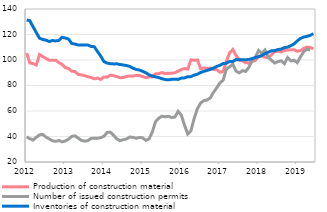
| Category | Production of construction material |
|---|---|
| 2012-01-01 | 105.487 |
| 2012-02-01 | 97.69 |
| 2012-03-01 | 97.16 |
| 2012-04-01 | 96.046 |
| 2012-05-01 | 104.325 |
| 2012-06-01 | 102.702 |
| 2012-07-01 | 101.24 |
| 2012-08-01 | 99.748 |
| 2012-09-01 | 99.904 |
| 2012-10-01 | 99.87 |
| 2012-11-01 | 97.946 |
| 2012-12-01 | 96.578 |
| 2013-01-01 | 93.977 |
| 2013-02-01 | 93.384 |
| 2013-03-01 | 91.126 |
| 2013-04-01 | 91.027 |
| 2013-05-01 | 88.668 |
| 2013-06-01 | 88.34 |
| 2013-07-01 | 87.726 |
| 2013-08-01 | 86.868 |
| 2013-09-01 | 86.315 |
| 2013-10-01 | 85.215 |
| 2013-11-01 | 85.818 |
| 2013-12-01 | 84.776 |
| 2014-01-01 | 86.746 |
| 2014-02-01 | 86.469 |
| 2014-03-01 | 88.187 |
| 2014-04-01 | 87.678 |
| 2014-05-01 | 86.986 |
| 2014-06-01 | 86.071 |
| 2014-07-01 | 86.234 |
| 2014-08-01 | 87.132 |
| 2014-09-01 | 87.453 |
| 2014-10-01 | 87.44 |
| 2014-11-01 | 87.89 |
| 2014-12-01 | 87.875 |
| 2015-01-01 | 86.911 |
| 2015-02-01 | 86.248 |
| 2015-03-01 | 86.871 |
| 2015-04-01 | 86.686 |
| 2015-05-01 | 89.154 |
| 2015-06-01 | 89.243 |
| 2015-07-01 | 90.178 |
| 2015-08-01 | 89.284 |
| 2015-09-01 | 89.665 |
| 2015-10-01 | 89.633 |
| 2015-11-01 | 89.97 |
| 2015-12-01 | 91.235 |
| 2016-01-01 | 92.547 |
| 2016-02-01 | 93.311 |
| 2016-03-01 | 92.868 |
| 2016-04-01 | 100.186 |
| 2016-05-01 | 99.747 |
| 2016-06-01 | 100.139 |
| 2016-07-01 | 93.121 |
| 2016-08-01 | 93.711 |
| 2016-09-01 | 93.476 |
| 2016-10-01 | 93.694 |
| 2016-11-01 | 92.492 |
| 2016-12-01 | 92.407 |
| 2017-01-01 | 90.394 |
| 2017-02-01 | 91.08 |
| 2017-03-01 | 99.114 |
| 2017-04-01 | 105.589 |
| 2017-05-01 | 108.224 |
| 2017-06-01 | 103.495 |
| 2017-07-01 | 100.257 |
| 2017-08-01 | 99.399 |
| 2017-09-01 | 97.795 |
| 2017-10-01 | 97.69 |
| 2017-11-01 | 98.842 |
| 2017-12-01 | 99.596 |
| 2018-01-01 | 102.997 |
| 2018-02-01 | 103.052 |
| 2018-03-01 | 102.137 |
| 2018-04-01 | 101.786 |
| 2018-05-01 | 104.161 |
| 2018-06-01 | 106.616 |
| 2018-07-01 | 106.869 |
| 2018-08-01 | 106.369 |
| 2018-09-01 | 107.369 |
| 2018-10-31 | 107.877 |
| 2018-11-30 | 108.044 |
| 2018-12-31 | 108.065 |
| 2019-01-31 | 106.869 |
| 2019-02-28 | 107.423 |
| 2019-03-31 | 109.059 |
| 2019-04-30 | 110.087 |
| 2019-05-31 | 109.811 |
| 2019-06-30 | 108.771 |